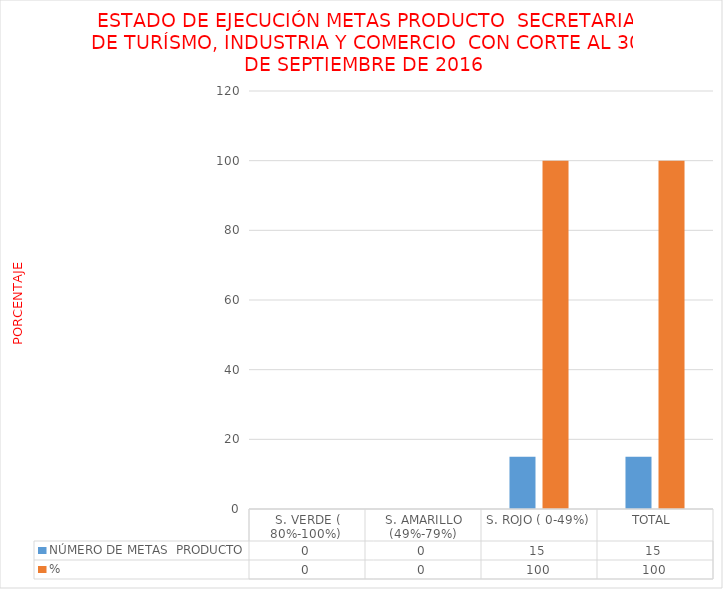
| Category | NÚMERO DE METAS  PRODUCTO  | % |
|---|---|---|
| S. VERDE ( 80%-100%)  | 0 | 0 |
| S. AMARILLO (49%-79%) | 0 | 0 |
| S. ROJO ( 0-49%) | 15 | 100 |
| TOTAL  | 15 | 100 |